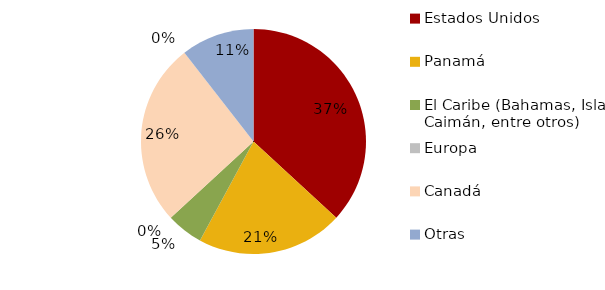
| Category | Series 0 |
|---|---|
| Estados Unidos | 0.368 |
| Panamá | 0.211 |
| El Caribe (Bahamas, Islas Caimán, entre otros) | 0.053 |
| Europa | 0 |
| Canadá | 0.263 |
| Asia | 0 |
| Otras | 0.105 |